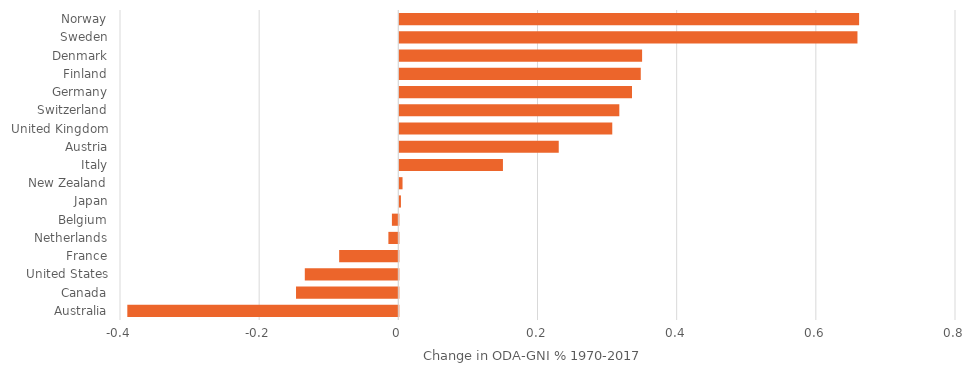
| Category | Series 0 |
|---|---|
| Australia | -0.389 |
| Canada | -0.147 |
| United States | -0.134 |
| France | -0.085 |
| Netherlands | -0.014 |
| Belgium | -0.009 |
| Japan | 0.002 |
| New Zealand | 0.005 |
| Italy | 0.149 |
| Austria | 0.229 |
| United Kingdom | 0.306 |
| Switzerland | 0.316 |
| Germany | 0.334 |
| Finland | 0.347 |
| Denmark | 0.349 |
| Sweden | 0.658 |
| Norway | 0.661 |